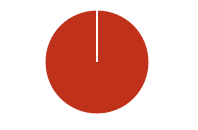
| Category | Total |
|---|---|
| Y | 0 |
| R | 0 |
| T | 0 |
| M | 0 |
| F | 0 |
| N | 170 |